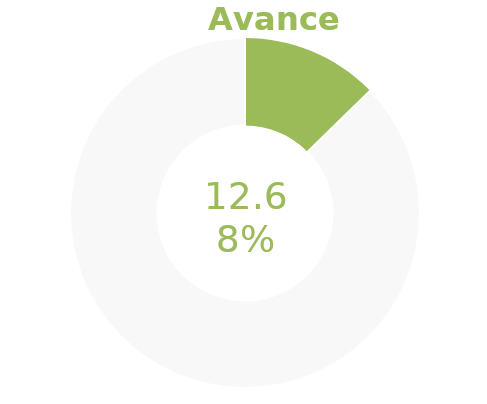
| Category | Series 0 |
|---|---|
| Acumulado 1 Trimestre | 0.127 |
| Año | -0.873 |